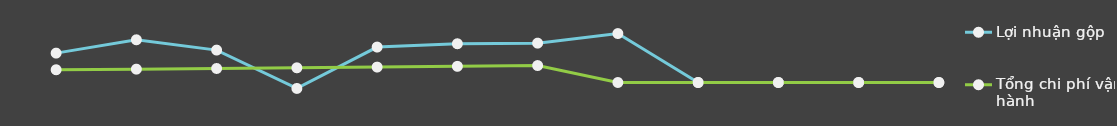
| Category | Lợi nhuận gộp | Tổng chi phí vận hành |
|---|---|---|
| 0 | 25000 | 10841 |
| 1 | 36348 | 11367.25 |
| 2 | 27562 | 11919.82 |
| 3 | -5059.5 | 12500.01 |
| 4 | 30153.18 | 13109.21 |
| 5 | 32964.45 | 13748.86 |
| 6 | 33502.87 | 14420.51 |
| 7 | 41646 | 0 |
| 8 | 0 | 0 |
| 9 | 0 | 0 |
| 10 | 0 | 0 |
| 11 | 0 | 0 |